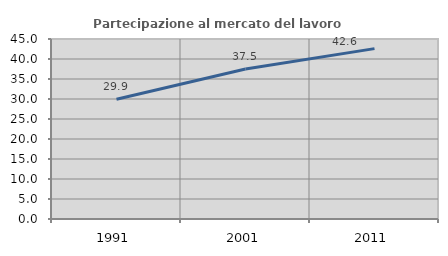
| Category | Partecipazione al mercato del lavoro  femminile |
|---|---|
| 1991.0 | 29.918 |
| 2001.0 | 37.5 |
| 2011.0 | 42.593 |